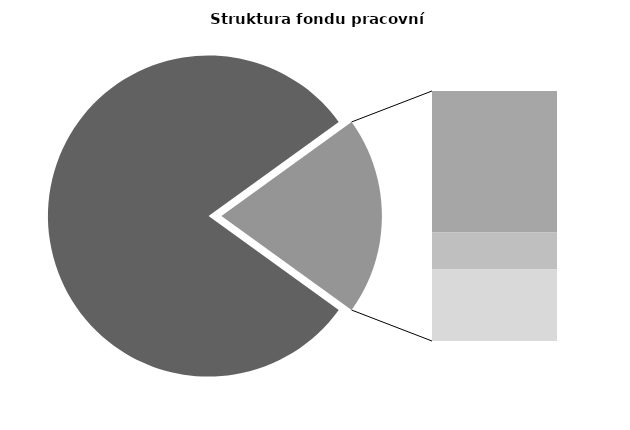
| Category | Series 0 |
|---|---|
| Průměrná měsíční odpracovaná doba bez přesčasu | 137.808 |
| Dovolená | 19.387 |
| Nemoc | 5.088 |
| Jiné | 9.793 |